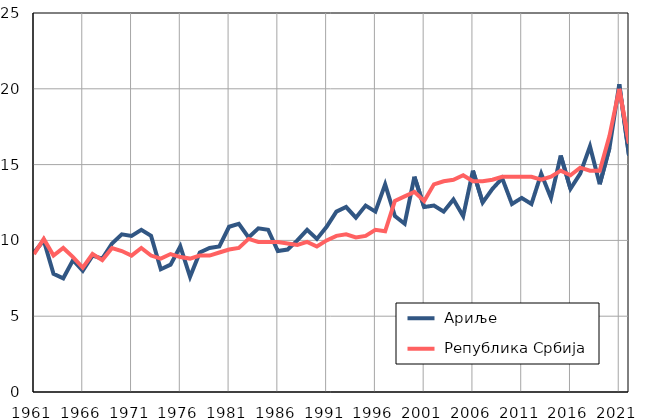
| Category |  Ариље |  Република Србија |
|---|---|---|
| 1961.0 | 9.2 | 9.1 |
| 1962.0 | 10 | 10.1 |
| 1963.0 | 7.8 | 9 |
| 1964.0 | 7.5 | 9.5 |
| 1965.0 | 8.7 | 8.9 |
| 1966.0 | 8 | 8.2 |
| 1967.0 | 9 | 9.1 |
| 1968.0 | 8.8 | 8.7 |
| 1969.0 | 9.8 | 9.5 |
| 1970.0 | 10.4 | 9.3 |
| 1971.0 | 10.3 | 9 |
| 1972.0 | 10.7 | 9.5 |
| 1973.0 | 10.3 | 9 |
| 1974.0 | 8.1 | 8.8 |
| 1975.0 | 8.4 | 9.1 |
| 1976.0 | 9.6 | 8.9 |
| 1977.0 | 7.6 | 8.8 |
| 1978.0 | 9.2 | 9 |
| 1979.0 | 9.5 | 9 |
| 1980.0 | 9.6 | 9.2 |
| 1981.0 | 10.9 | 9.4 |
| 1982.0 | 11.1 | 9.5 |
| 1983.0 | 10.2 | 10.1 |
| 1984.0 | 10.8 | 9.9 |
| 1985.0 | 10.7 | 9.9 |
| 1986.0 | 9.3 | 9.9 |
| 1987.0 | 9.4 | 9.8 |
| 1988.0 | 10 | 9.7 |
| 1989.0 | 10.7 | 9.9 |
| 1990.0 | 10.1 | 9.6 |
| 1991.0 | 10.9 | 10 |
| 1992.0 | 11.9 | 10.3 |
| 1993.0 | 12.2 | 10.4 |
| 1994.0 | 11.5 | 10.2 |
| 1995.0 | 12.3 | 10.3 |
| 1996.0 | 11.9 | 10.7 |
| 1997.0 | 13.7 | 10.6 |
| 1998.0 | 11.6 | 12.6 |
| 1999.0 | 11.1 | 12.9 |
| 2000.0 | 14.2 | 13.2 |
| 2001.0 | 12.2 | 12.6 |
| 2002.0 | 12.3 | 13.7 |
| 2003.0 | 11.9 | 13.9 |
| 2004.0 | 12.7 | 14 |
| 2005.0 | 11.6 | 14.3 |
| 2006.0 | 14.6 | 13.9 |
| 2007.0 | 12.5 | 13.9 |
| 2008.0 | 13.4 | 14 |
| 2009.0 | 14.1 | 14.2 |
| 2010.0 | 12.4 | 14.2 |
| 2011.0 | 12.8 | 14.2 |
| 2012.0 | 12.4 | 14.2 |
| 2013.0 | 14.4 | 14 |
| 2014.0 | 12.8 | 14.2 |
| 2015.0 | 15.6 | 14.6 |
| 2016.0 | 13.4 | 14.3 |
| 2017.0 | 14.4 | 14.8 |
| 2018.0 | 16.2 | 14.6 |
| 2019.0 | 13.7 | 14.6 |
| 2020.0 | 16.1 | 16.9 |
| 2021.0 | 20.3 | 20 |
| 2022.0 | 15.6 | 16.4 |